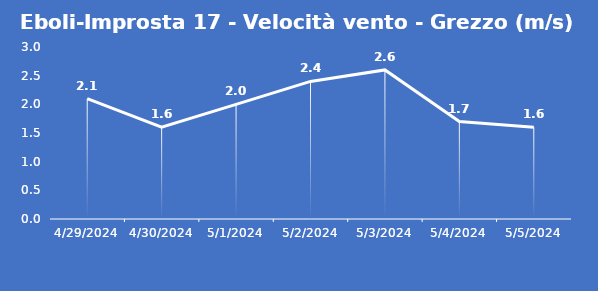
| Category | Eboli-Improsta 17 - Velocità vento - Grezzo (m/s) |
|---|---|
| 4/29/24 | 2.1 |
| 4/30/24 | 1.6 |
| 5/1/24 | 2 |
| 5/2/24 | 2.4 |
| 5/3/24 | 2.6 |
| 5/4/24 | 1.7 |
| 5/5/24 | 1.6 |